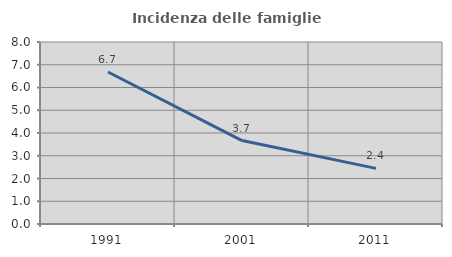
| Category | Incidenza delle famiglie numerose |
|---|---|
| 1991.0 | 6.68 |
| 2001.0 | 3.669 |
| 2011.0 | 2.444 |